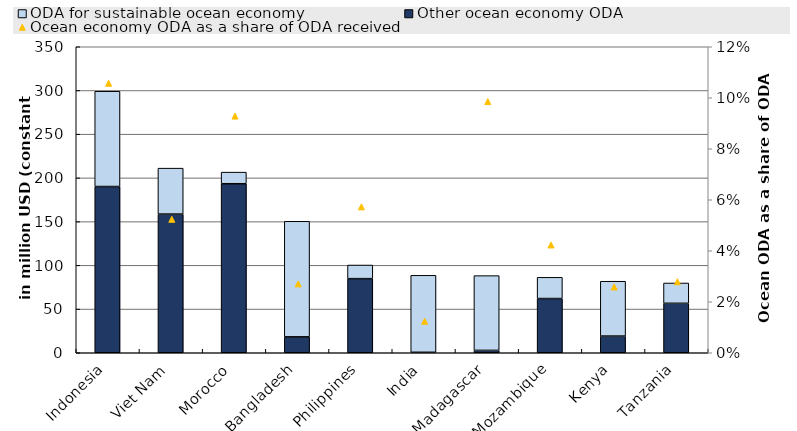
| Category | Other ocean economy ODA | ODA for sustainable ocean economy |
|---|---|---|
| Indonesia | 190.124 | 108.987 |
| Viet Nam | 158.629 | 52.534 |
| Morocco | 193.32 | 13.294 |
| Bangladesh | 18.21 | 132.147 |
| Philippines | 84.77 | 15.581 |
| India | 0.516 | 88.062 |
| Madagascar | 2.708 | 85.51 |
| Mozambique | 62.02 | 24.278 |
| Kenya | 19.08 | 62.729 |
| Tanzania | 56.551 | 23.235 |